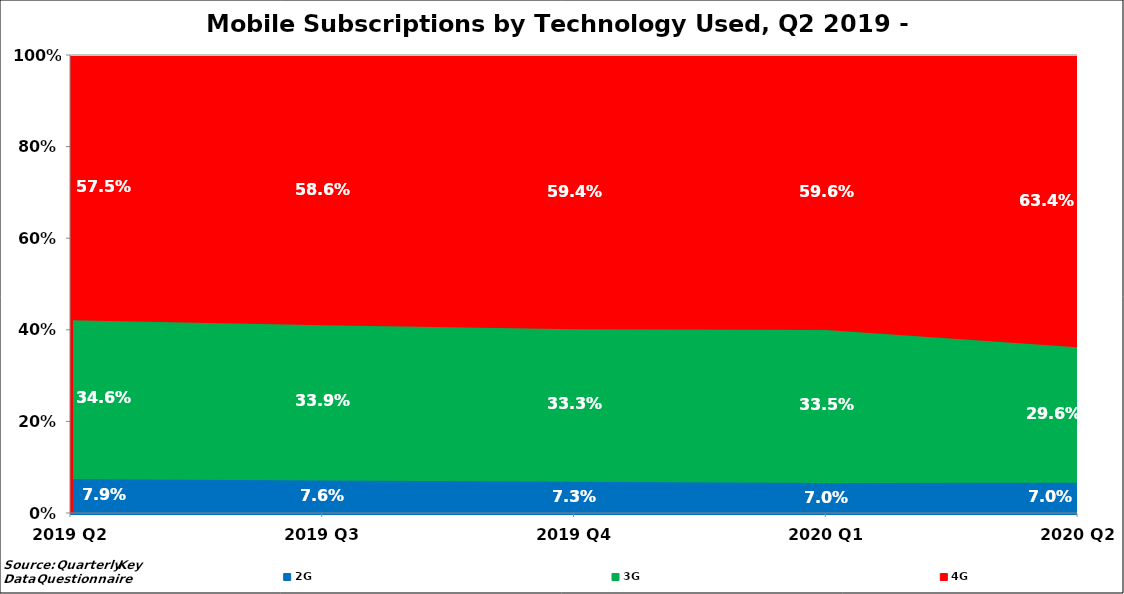
| Category | 2G | 3G | 4G |
|---|---|---|---|
| 2019 Q2 | 0.079 | 0.346 | 0.575 |
| 2019 Q3 | 0.076 | 0.339 | 0.586 |
| 2019 Q4 | 0.073 | 0.333 | 0.594 |
| 2020 Q1 | 0.07 | 0.335 | 0.596 |
| 2020 Q2 | 0.07 | 0.296 | 0.634 |